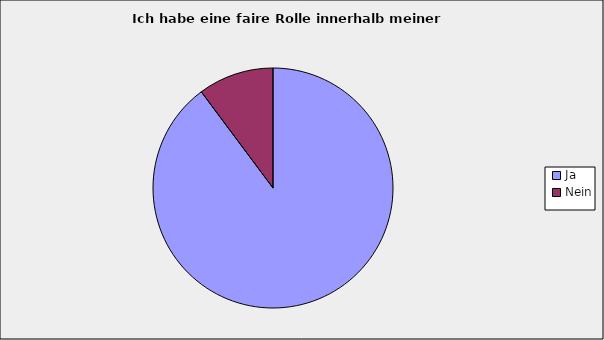
| Category | Series 0 |
|---|---|
| Ja | 0.898 |
| Nein | 0.102 |